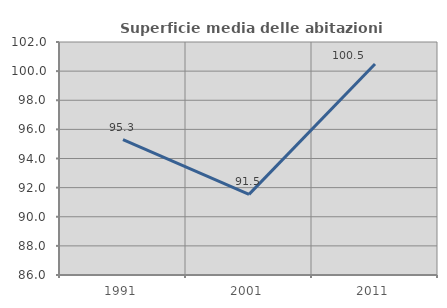
| Category | Superficie media delle abitazioni occupate |
|---|---|
| 1991.0 | 95.299 |
| 2001.0 | 91.534 |
| 2011.0 | 100.49 |